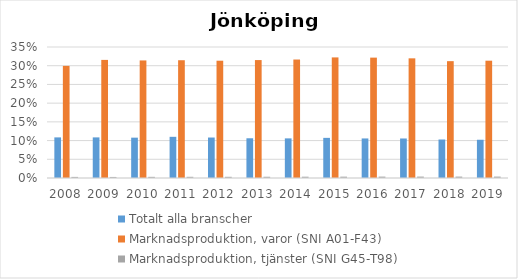
| Category | Totalt alla branscher | Marknadsproduktion, varor (SNI A01-F43) | Marknadsproduktion, tjänster (SNI G45-T98) |
|---|---|---|---|
| 2008.0 | 0.109 | 0.3 | 0.003 |
| 2009.0 | 0.109 | 0.316 | 0.003 |
| 2010.0 | 0.108 | 0.314 | 0.003 |
| 2011.0 | 0.11 | 0.315 | 0.003 |
| 2012.0 | 0.108 | 0.313 | 0.003 |
| 2013.0 | 0.106 | 0.315 | 0.003 |
| 2014.0 | 0.106 | 0.317 | 0.003 |
| 2015.0 | 0.107 | 0.322 | 0.004 |
| 2016.0 | 0.106 | 0.322 | 0.004 |
| 2017.0 | 0.106 | 0.32 | 0.004 |
| 2018.0 | 0.103 | 0.312 | 0.004 |
| 2019.0 | 0.102 | 0.313 | 0.004 |